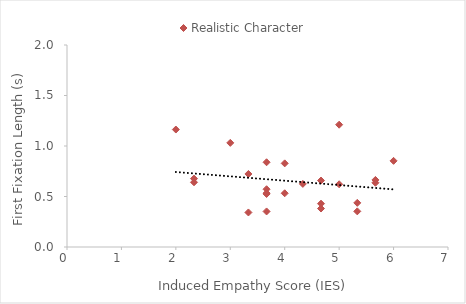
| Category | Realistic Character |
|---|---|
| 5.666666666666667 | 0.664 |
| 3.6666666666666665 | 0.533 |
| 2.3333333333333335 | 0.677 |
| 4.666666666666667 | 0.658 |
| 5.0 | 1.211 |
| 4.0 | 0.828 |
| 3.6666666666666665 | 0.839 |
| 5.0 | 0.621 |
| 2.0 | 1.163 |
| 5.333333333333333 | 0.353 |
| 3.6666666666666665 | 0.572 |
| 6.0 | 0.853 |
| 3.3333333333333335 | 0.342 |
| 5.666666666666667 | 0.636 |
| 3.6666666666666665 | 0.525 |
| 3.6666666666666665 | 0.352 |
| 5.333333333333333 | 0.437 |
| 3.0 | 1.031 |
| 4.666666666666667 | 0.381 |
| 2.3333333333333335 | 0.641 |
| 4.666666666666667 | 0.429 |
| 4.0 | 0.532 |
| 3.3333333333333335 | 0.723 |
| 4.333333333333333 | 0.625 |